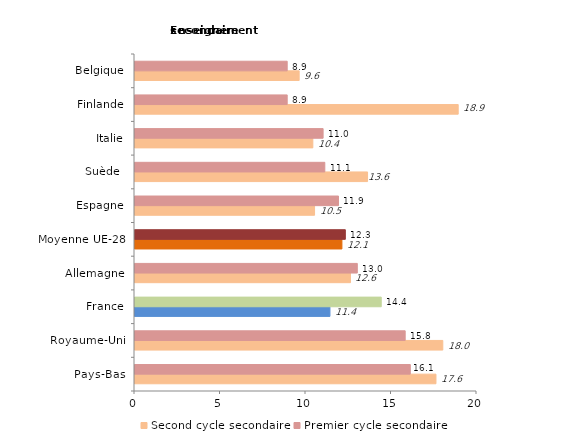
| Category | Second cycle secondaire | Premier cycle secondaire |
|---|---|---|
| Pays-Bas | 17.6 | 16.1 |
| Royaume-Uni | 18 | 15.8 |
| France | 11.4 | 14.4 |
| Allemagne | 12.6 | 13 |
| Moyenne UE-28 | 12.1 | 12.3 |
| Espagne | 10.5 | 11.9 |
| Suède  | 13.6 | 11.1 |
| Italie | 10.4 | 11 |
| Finlande | 18.9 | 8.9 |
| Belgique | 9.6 | 8.9 |